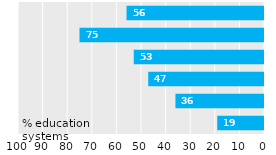
| Category | Action |
|---|---|
| ECEC | 55.882 |
| Primary-upper secondary | 75 |
| Post-secondary, non-tertiary | 52.941 |
| Tertiary | 47.059 |
| Adult education | 36 |
| Not known | 19 |